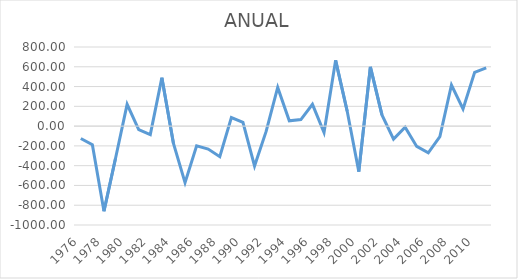
| Category | ANUAL |
|---|---|
| 1976.0 | -125.711 |
| 1977.0 | -188.611 |
| 1978.0 | -860.911 |
| 1979.0 | -325.111 |
| 1980.0 | 220.289 |
| 1981.0 | -36.211 |
| 1982.0 | -86.111 |
| 1983.0 | 489.889 |
| 1984.0 | -175.511 |
| 1985.0 | -571.911 |
| 1986.0 | -199.711 |
| 1987.0 | -232.211 |
| 1988.0 | -308.811 |
| 1989.0 | 86.889 |
| 1990.0 | 37.689 |
| 1991.0 | -402.911 |
| 1992.0 | -53.811 |
| 1993.0 | 390.589 |
| 1994.0 | 53.489 |
| 1995.0 | 65.789 |
| 1996.0 | 220.189 |
| 1997.0 | -64.311 |
| 1998.0 | 665.089 |
| 1999.0 | 150.489 |
| 2000.0 | -460.411 |
| 2001.0 | 599.789 |
| 2002.0 | 113.189 |
| 2003.0 | -131.111 |
| 2004.0 | -11.511 |
| 2005.0 | -205.211 |
| 2006.0 | -270.311 |
| 2007.0 | -106.011 |
| 2008.0 | 415.789 |
| 2009.0 | 173.889 |
| 2010.0 | 544.089 |
| 2011.0 | 589.289 |